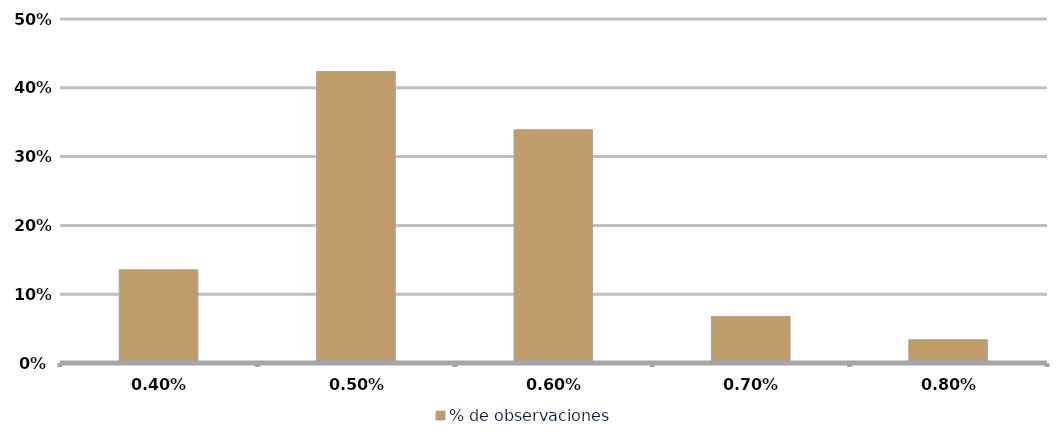
| Category | % de observaciones  |
|---|---|
| 0.004 | 0.136 |
| 0.005 | 0.424 |
| 0.006 | 0.339 |
| 0.007 | 0.068 |
| 0.008 | 0.034 |